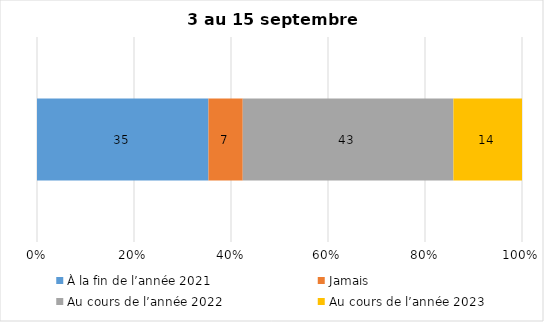
| Category | À la fin de l’année 2021 | Jamais | Au cours de l’année 2022 | Au cours de l’année 2023 |
|---|---|---|---|---|
| 0 | 35 | 7 | 43 | 14 |